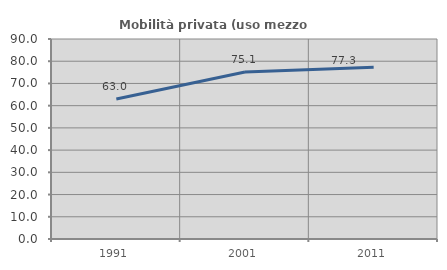
| Category | Mobilità privata (uso mezzo privato) |
|---|---|
| 1991.0 | 62.991 |
| 2001.0 | 75.13 |
| 2011.0 | 77.319 |